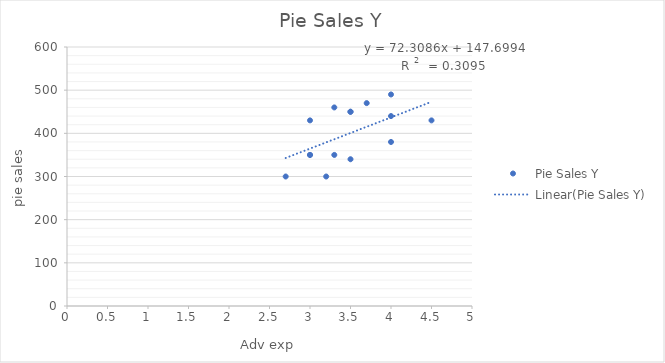
| Category | Pie Sales Y |
|---|---|
| 3.3 | 350 |
| 3.3 | 460 |
| 3.0 | 350 |
| 4.5 | 430 |
| 3.0 | 350 |
| 4.0 | 380 |
| 3.0 | 430 |
| 3.7 | 470 |
| 3.5 | 450 |
| 4.0 | 490 |
| 3.5 | 340 |
| 3.2 | 300 |
| 4.0 | 440 |
| 3.5 | 450 |
| 2.7 | 300 |